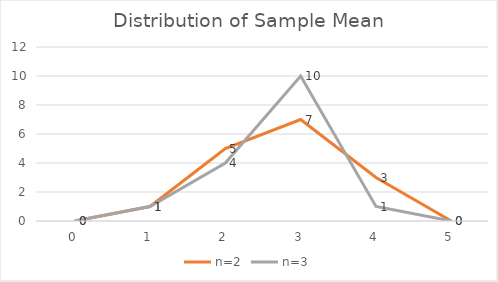
| Category | n=2 | n=3 |
|---|---|---|
| 0.0 | 0 | 0 |
| 1.0 | 1 | 1 |
| 2.0 | 5 | 4 |
| 3.0 | 7 | 10 |
| 4.0 | 3 | 1 |
| 5.0 | 0 | 0 |